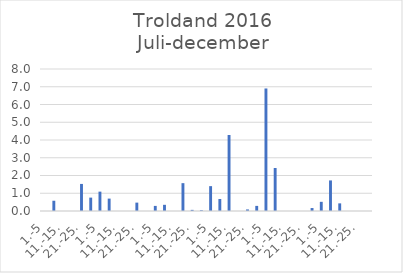
| Category | Series 0 |
|---|---|
| 1.-5 | 0 |
| 6.-10. | 0.578 |
| 11.-15. | 0 |
| 16.-20. | 0 |
| 21.-25. | 1.525 |
| 26.-31. | 0.754 |
| 1.-5 | 1.091 |
| 6.-10. | 0.699 |
| 11.-15. | 0 |
| 16.-20. | 0 |
| 21.-25. | 0.472 |
| 26.-31. | 0 |
| 1.-5 | 0.287 |
| 6.-10. | 0.348 |
| 11.-15. | 0 |
| 16.-20. | 1.569 |
| 21.-25. | 0.064 |
| 26.-30. | 0.043 |
| 1.-5 | 1.401 |
| 6.-10. | 0.675 |
| 11.-15. | 4.282 |
| 16.-20. | 0 |
| 21.-25. | 0.089 |
| 26.-31. | 0.288 |
| 1.-5 | 6.903 |
| 6.-10. | 2.421 |
| 11.-15. | 0 |
| 16.-20. | 0 |
| 21.-25. | 0 |
| 26.-30. | 0.167 |
| 1.-5 | 0.517 |
| 6.-10. | 1.722 |
| 11.-15. | 0.43 |
| 16.-20. | 0 |
| 21.-25. | 0 |
| 26.-31. | 0 |